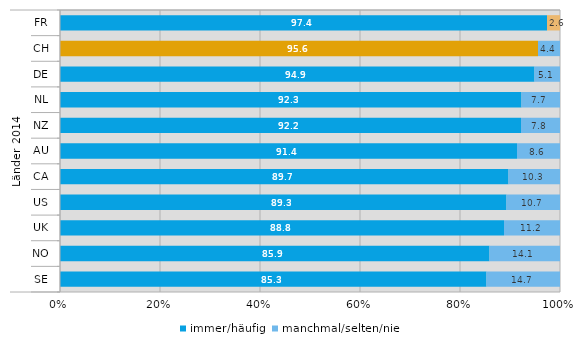
| Category | immer/häufig | manchmal/selten/nie |
|---|---|---|
| 0 | 97.4 | 2.6 |
| 1 | 95.6 | 4.4 |
| 2 | 94.9 | 5.1 |
| 3 | 92.3 | 7.7 |
| 4 | 92.2 | 7.8 |
| 5 | 91.4 | 8.6 |
| 6 | 89.7 | 10.3 |
| 7 | 89.3 | 10.7 |
| 8 | 88.8 | 11.2 |
| 9 | 85.9 | 14.1 |
| 10 | 85.3 | 14.7 |